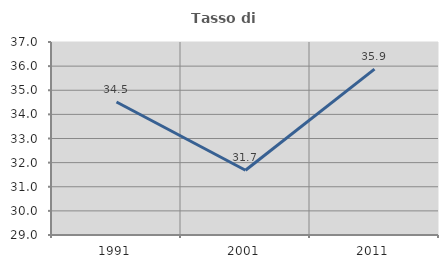
| Category | Tasso di occupazione   |
|---|---|
| 1991.0 | 34.513 |
| 2001.0 | 31.686 |
| 2011.0 | 35.874 |